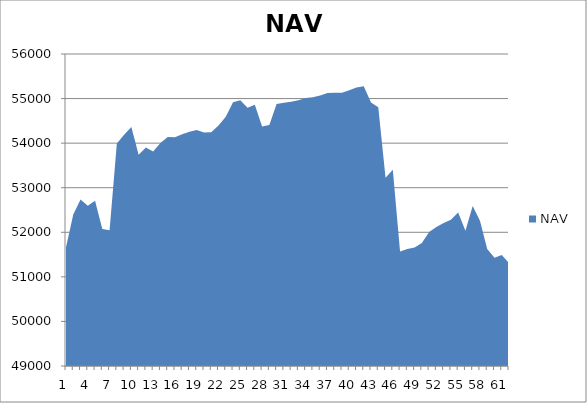
| Category | NAV |
|---|---|
| 0 | 51667 |
| 1 | 52397 |
| 2 | 52733.957 |
| 3 | 52597.875 |
| 4 | 52708.772 |
| 5 | 52075.184 |
| 6 | 52046.775 |
| 7 | 53991.219 |
| 8 | 54189.909 |
| 9 | 54364.909 |
| 10 | 53739.909 |
| 11 | 53899.542 |
| 12 | 53812.294 |
| 13 | 54003.961 |
| 14 | 54140.037 |
| 15 | 54132.37 |
| 16 | 54197.37 |
| 17 | 54255.812 |
| 18 | 54292.622 |
| 19 | 54240.699 |
| 20 | 54246.834 |
| 21 | 54397.391 |
| 22 | 54592.197 |
| 23 | 54920.119 |
| 24 | 54963.245 |
| 25 | 54796.799 |
| 26 | 54863.963 |
| 27 | 54375.975 |
| 28 | 54409.015 |
| 29 | 54878.402 |
| 30 | 54905.151 |
| 31 | 54927.958 |
| 32 | 54964.157 |
| 33 | 55012.385 |
| 34 | 55031.616 |
| 35 | 55070.791 |
| 36 | 55126.461 |
| 37 | 55131.71 |
| 38 | 55133.391 |
| 39 | 55184.783 |
| 40 | 55249.119 |
| 41 | 55278.196 |
| 42 | 54909.993 |
| 43 | 54807.052 |
| 44 | 53224.092 |
| 45 | 53401.214 |
| 46 | 51567.133 |
| 47 | 51627.536 |
| 48 | 51656.382 |
| 49 | 51762.295 |
| 50 | 52007.329 |
| 51 | 52120.149 |
| 52 | 52206.26 |
| 53 | 52279.944 |
| 54 | 52443.406 |
| 55 | 52034.315 |
| 56 | 52592.093 |
| 57 | 52259.795 |
| 58 | 51622.988 |
| 59 | 51427.586 |
| 60 | 51492.401 |
| 61 | 51307.336 |